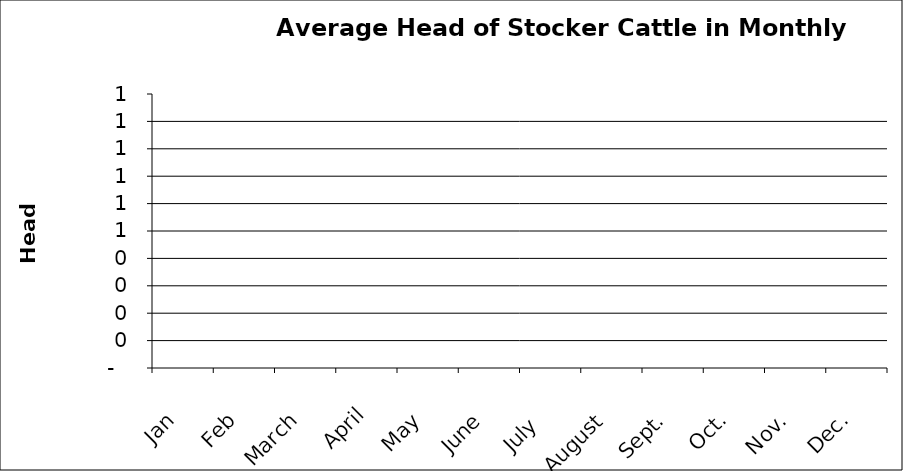
| Category | Head |
|---|---|
| Jan | 0 |
| Feb | 0 |
| March | 0 |
| April | 0 |
| May | 0 |
| June | 0 |
| July  | 0 |
| August | 0 |
| Sept. | 0 |
| Oct. | 0 |
| Nov. | 0 |
| Dec. | 0 |